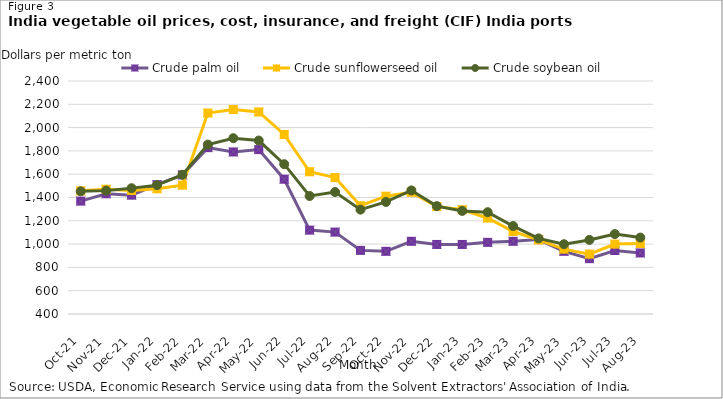
| Category | Crude palm oil | Crude sunflowerseed oil | Crude soybean oil |
|---|---|---|---|
| 2021-10-01 | 1369 | 1457 | 1453 |
| 2021-11-01 | 1432 | 1471 | 1459 |
| 2021-12-01 | 1420 | 1460 | 1480 |
| 2022-01-01 | 1510 | 1475 | 1506 |
| 2022-02-01 | 1594 | 1506 | 1595 |
| 2022-03-04 | 1828 | 2125 | 1854 |
| 2022-04-03 | 1791 | 2155 | 1909 |
| 2022-05-03 | 1811 | 2134 | 1889 |
| 2022-06-02 | 1557 | 1941 | 1686 |
| 2022-07-02 | 1120 | 1621 | 1413 |
| 2022-08-01 | 1103 | 1571 | 1447 |
| 2022-09-01 | 946 | 1329 | 1296 |
| 2022-10-21 | 938 | 1411 | 1362 |
| 2022-11-22 | 1024 | 1445 | 1461 |
| 2022-12-22 | 997 | 1322 | 1326 |
| 2023-01-21 | 997 | 1295 | 1285 |
| 2023-02-18 | 1015 | 1224 | 1274 |
| 2023-03-21 | 1024 | 1108 | 1155 |
| 2023-04-21 | 1039 | 1036 | 1049 |
| 2023-05-21 | 938 | 957 | 999 |
| 2023-06-20 | 875 | 914 | 1036 |
| 2023-07-21 | 945 | 1000 | 1086 |
| 2023-08-20 | 924 | 1005 | 1056 |